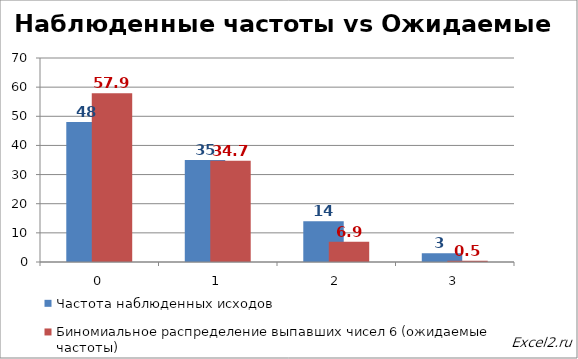
| Category | Частота наблюденных исходов | Биномиальное распределение выпавших чисел 6 (ожидаемые частоты) |
|---|---|---|
| 0.0 | 48 | 57.87 |
| 1.0 | 35 | 34.722 |
| 2.0 | 14 | 6.944 |
| 3.0 | 3 | 0.463 |